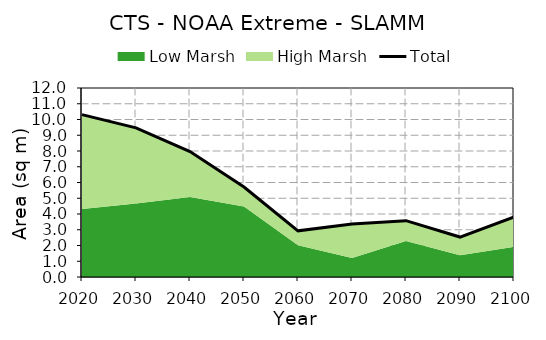
| Category | Total |
|---|---|
| 0 | 10.309 |
| 1 | 9.47 |
| 2 | 7.966 |
| 3 | 5.713 |
| 4 | 2.93 |
| 5 | 3.365 |
| 6 | 3.576 |
| 7 | 2.537 |
| 8 | 3.808 |